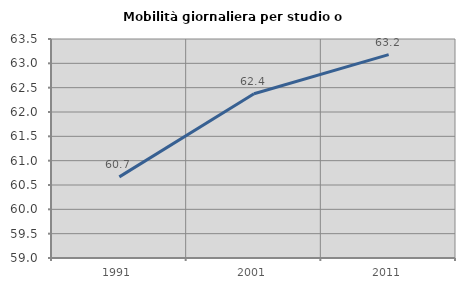
| Category | Mobilità giornaliera per studio o lavoro |
|---|---|
| 1991.0 | 60.667 |
| 2001.0 | 62.375 |
| 2011.0 | 63.18 |